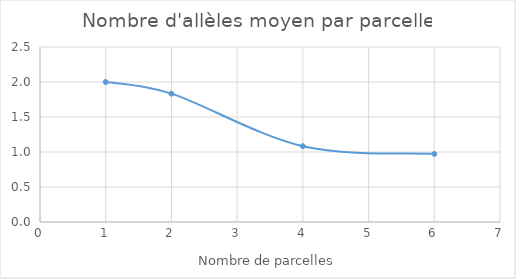
| Category | Nombre d'allèles moyen par parcelle |
|---|---|
| 1.0 | 2 |
| 2.0 | 1.833 |
| 4.0 | 1.083 |
| 6.0 | 0.972 |